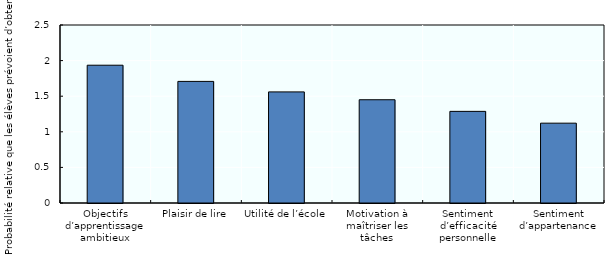
| Category | Series 0 |
|---|---|
| Objectifs d’apprentissage ambitieux | 1.935 |
| Plaisir de lire | 1.708 |
| Utilité de l’école | 1.56 |
| Motivation à maîtriser les tâches | 1.45 |
| Sentiment d’efficacité personnelle | 1.287 |
| Sentiment d’appartenance | 1.121 |